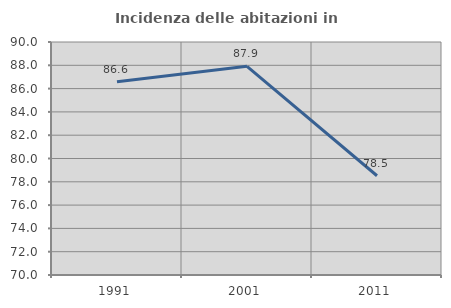
| Category | Incidenza delle abitazioni in proprietà  |
|---|---|
| 1991.0 | 86.589 |
| 2001.0 | 87.914 |
| 2011.0 | 78.521 |